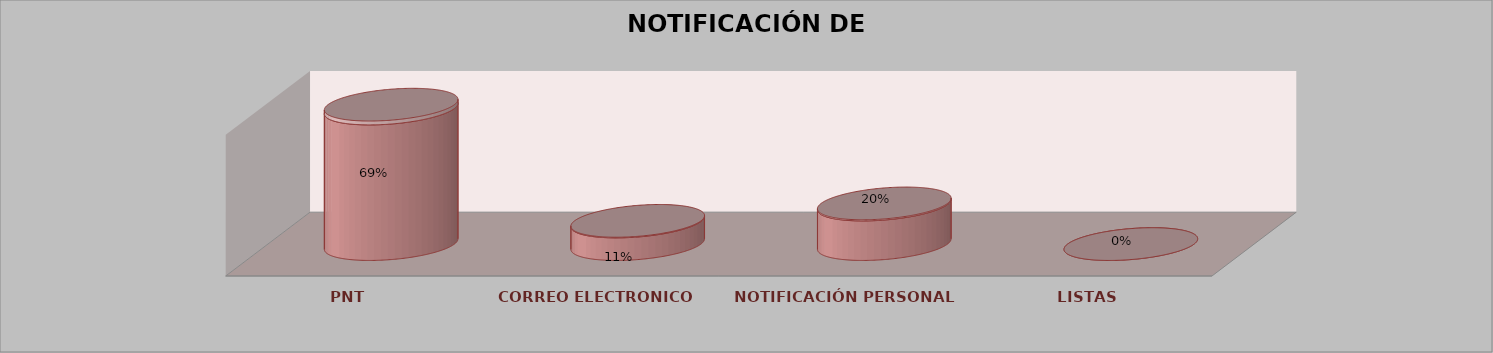
| Category | Series 0 | Series 1 | Series 2 | Series 3 | Series 4 |
|---|---|---|---|---|---|
| PNT |  |  |  | 24 | 0.686 |
| CORREO ELECTRONICO |  |  |  | 4 | 0.114 |
| NOTIFICACIÓN PERSONAL |  |  |  | 7 | 0.2 |
| LISTAS |  |  |  | 0 | 0 |